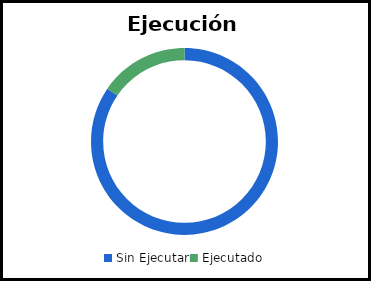
| Category | Ejecución Obligaciones |
|---|---|
| Sin Ejecutar | 0.846 |
| Ejecutado | 0.154 |